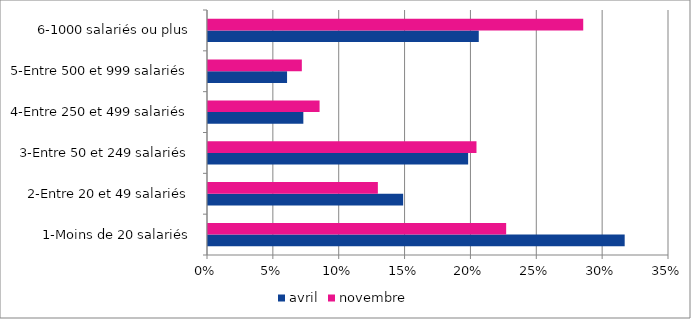
| Category | avril | novembre |
|---|---|---|
| 1-Moins de 20 salariés | 0.316 | 0.226 |
| 2-Entre 20 et 49 salariés | 0.148 | 0.129 |
| 3-Entre 50 et 249 salariés | 0.198 | 0.204 |
| 4-Entre 250 et 499 salariés | 0.072 | 0.085 |
| 5-Entre 500 et 999 salariés | 0.06 | 0.071 |
| 6-1000 salariés ou plus | 0.206 | 0.285 |